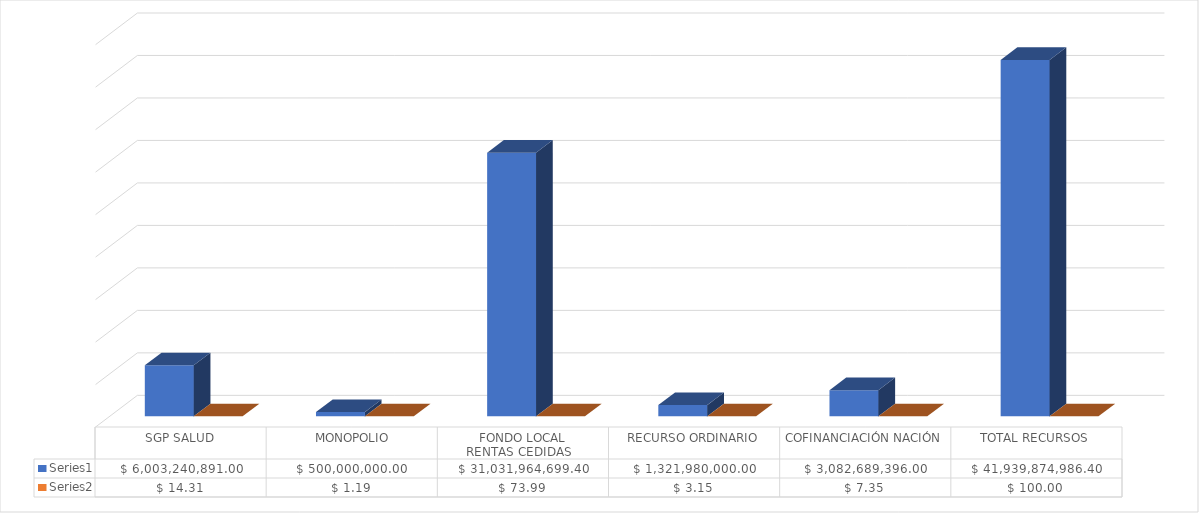
| Category | Series 0 | Series 1 |
|---|---|---|
|  SGP SALUD  | 6003240891 | 14.314 |
|   MONOPOLIO  | 500000000 | 1.192 |
|  FONDO LOCAL 
RENTAS CEDIDAS   | 31031964699.4 | 73.992 |
|  RECURSO ORDINARIO  | 1321980000 | 3.152 |
|  COFINANCIACIÓN NACIÓN  | 3082689396 | 7.35 |
|  TOTAL RECURSOS  | 41939874986.4 | 100 |